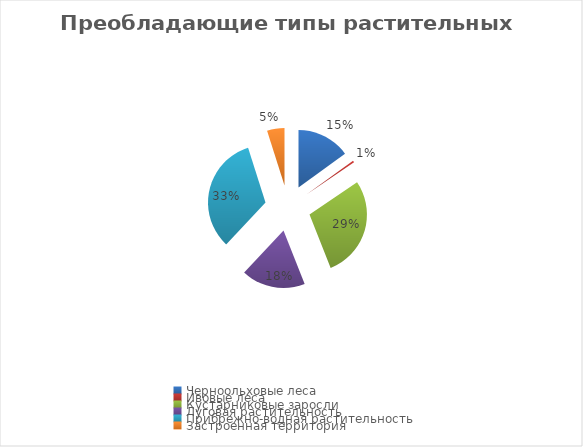
| Category | Series 0 |
|---|---|
| Черноольховые леса | 15 |
| Ивовые леса | 0.5 |
| Кустарниковые заросли | 28.5 |
| Луговая растительность | 18 |
| Прибрежно-водная растительность | 33.1 |
| Застроенная территория | 4.9 |